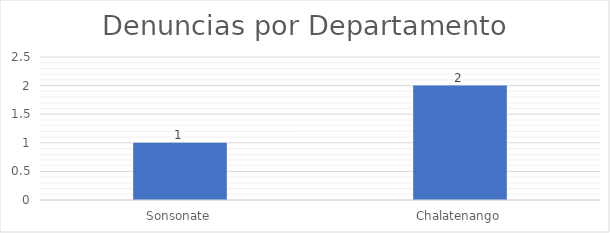
| Category | Series 0 |
|---|---|
| Sonsonate | 1 |
| Chalatenango | 2 |